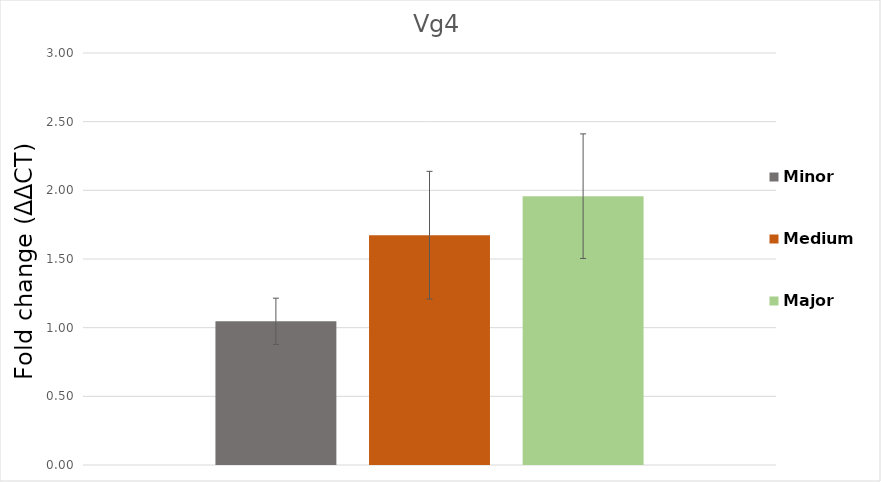
| Category | Minor | Medium | Major |
|---|---|---|---|
| Vg4 | 1.046 | 1.674 | 1.957 |